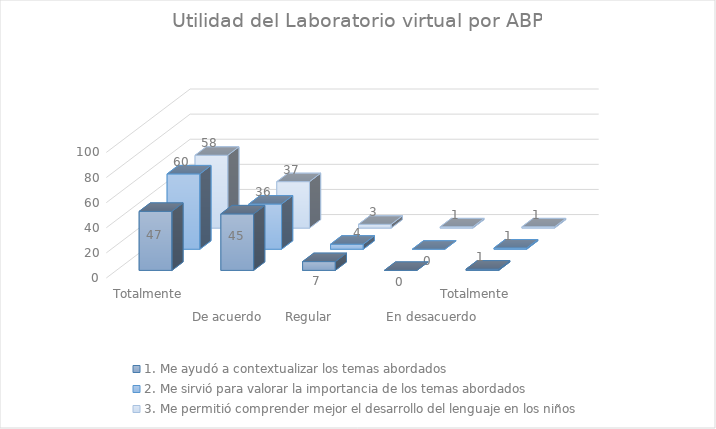
| Category | 1. Me ayudó a contextualizar los temas abordados | 2. Me sirvió para valorar la importancia de los temas abordados | 3. Me permitió comprender mejor el desarrollo del lenguaje en los niños |
|---|---|---|---|
| 0 | 47 | 60 | 58 |
| 1 | 45 | 36 | 37 |
| 2 | 7 | 4 | 3 |
| 3 | 0 | 0 | 1 |
| 4 | 1 | 1 | 1 |